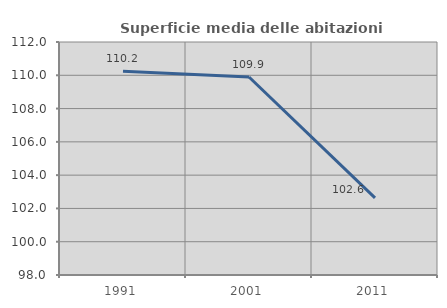
| Category | Superficie media delle abitazioni occupate |
|---|---|
| 1991.0 | 110.245 |
| 2001.0 | 109.895 |
| 2011.0 | 102.635 |